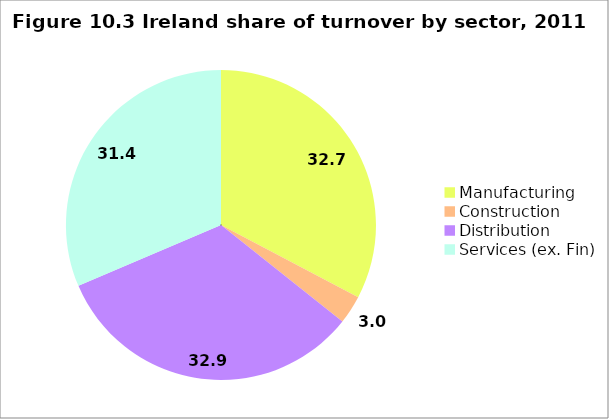
| Category | Ireland |
|---|---|
| Manufacturing | 32.708 |
| Construction | 2.976 |
| Distribution | 32.896 |
| Services (ex. Fin) | 31.42 |